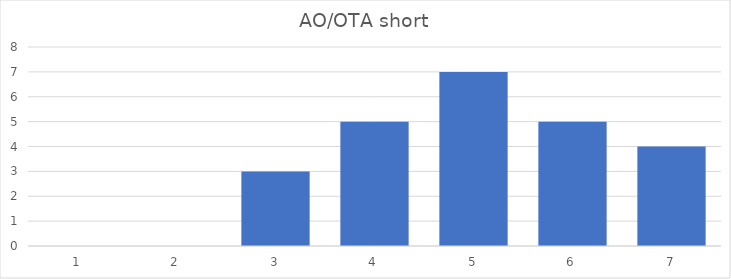
| Category | AO/OTA | AO/OTA short |
|---|---|---|
| 0 | 0 | 0 |
| 1 | 7 | 0 |
| 2 | 4 | 3 |
| 3 | 6 | 5 |
| 4 | 2 | 7 |
| 5 | 5 | 5 |
| 6 | 0 | 4 |